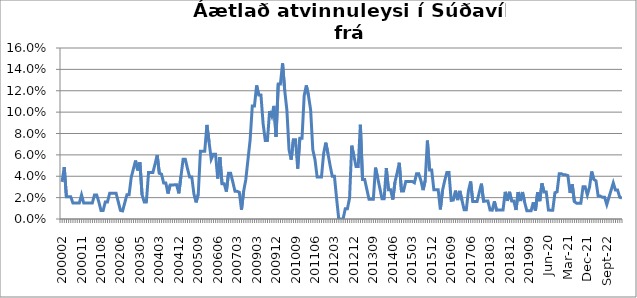
| Category | Series 0 |
|---|---|
| 200002 | 0.035 |
| 200003 | 0.049 |
| 200004 | 0.021 |
| 200005 | 0.021 |
| 200006 | 0.021 |
| 200007 | 0.015 |
| 200008 | 0.015 |
| 200009 | 0.015 |
| 200010 | 0.015 |
| 200011 | 0.023 |
| 200012 | 0.015 |
| 200101 | 0.015 |
| 200102 | 0.015 |
| 200103 | 0.015 |
| 200104 | 0.015 |
| 200105 | 0.023 |
| 200106 | 0.023 |
| 200107 | 0.016 |
| 200108 | 0.008 |
| 200110 | 0.008 |
| 200111 | 0.016 |
| 200112 | 0.016 |
| 200201 | 0.024 |
| 200202 | 0.024 |
| 200203 | 0.024 |
| 200204 | 0.024 |
| 200205 | 0.016 |
| 200206 | 0.008 |
| 200209 | 0.008 |
| 200210 | 0.015 |
| 200211 | 0.023 |
| 200212 | 0.023 |
| 200301 | 0.039 |
| 200302 | 0.047 |
| 200303 | 0.055 |
| 200304 | 0.045 |
| 200305 | 0.053 |
| 200306 | 0.023 |
| 200307 | 0.016 |
| 200309 | 0.016 |
| 200310 | 0.043 |
| 200311 | 0.043 |
| 200312 | 0.043 |
| 200401 | 0.051 |
| 200402 | 0.06 |
| 200403 | 0.043 |
| 200404 | 0.042 |
| 200405 | 0.034 |
| 200406 | 0.034 |
| 200407 | 0.024 |
| 200408 | 0.032 |
| 200409 | 0.032 |
| 200410 | 0.032 |
| 200411 | 0.032 |
| 200412 | 0.024 |
| 200501 | 0.04 |
| 200502 | 0.056 |
| 200503 | 0.056 |
| 200504 | 0.047 |
| 200505 | 0.039 |
| 200506 | 0.039 |
| 200507 | 0.023 |
| 200508 | 0.016 |
| 200509 | 0.023 |
| 200510 | 0.063 |
| 200511 | 0.063 |
| 200512 | 0.063 |
| 200601 | 0.088 |
| 200602 | 0.072 |
| 200603 | 0.056 |
| 200604 | 0.061 |
| 200605 | 0.061 |
| 200606 | 0.038 |
| 200607 | 0.058 |
| 200608 | 0.033 |
| 200609 | 0.033 |
| 200610 | 0.026 |
| 200611 | 0.043 |
| 200612 | 0.043 |
| 200701 | 0.034 |
| 200702 | 0.026 |
| 200703 | 0.026 |
| 200704 | 0.025 |
| 200709 | 0.009 |
| 200809 | 0.026 |
| 200810 | 0.037 |
| 200811 | 0.056 |
| 200812 | 0.074 |
| 200901 | 0.106 |
| 200902 | 0.106 |
| 200903 | 0.125 |
| 200904 | 0.116 |
| 200905 | 0.116 |
| 200906 | 0.089 |
| 200907 | 0.073 |
| 200908 | 0.073 |
| 200909 | 0.101 |
| 200910 | 0.096 |
| 200911 | 0.106 |
| 200912 | 0.077 |
| 201001 | 0.126 |
| 201002 | 0.126 |
| 201003 | 0.146 |
| 201004 | 0.12 |
| 201005 | 0.102 |
| 201006 | 0.065 |
| 201007 | 0.056 |
| 201008 | 0.074 |
| 201009 | 0.074 |
| 201010 | 0.047 |
| 201011 | 0.075 |
| 201012 | 0.075 |
| 201101 | 0.115 |
| 201102 | 0.125 |
| 201103 | 0.115 |
| 201104 | 0.102 |
| 201105 | 0.065 |
| 201106 | 0.056 |
| 201107 | 0.039 |
| 201108 | 0.039 |
| 201109 | 0.039 |
| 201110 | 0.061 |
| 201111 | 0.071 |
| 201112 | 0.061 |
| 201201 | 0.05 |
| 201202 | 0.04 |
| 201203 | 0.04 |
| 201204 | 0.019 |
| 201205 | 0 |
| 201206 | 0 |
| 201207 | 0 |
| 201208 | 0.01 |
| 201209 | 0.01 |
| 201210 | 0.02 |
| 201211 | 0.069 |
| 201212 | 0.059 |
| 201301 | 0.049 |
| 201302 | 0.049 |
| 201303 | 0.088 |
| 201304 | 0.037 |
| 201305 | 0.037 |
| 201306 | 0.028 |
| 201307 | 0.019 |
| 201308 | 0.019 |
| 201309 | 0.019 |
| 201310 | 0.048 |
| 201311 | 0.038 |
| 201312 | 0.029 |
| 201401 | 0.019 |
| 201402 | 0.019 |
| 201403 | 0.048 |
| 201404 | 0.027 |
| 201405 | 0.027 |
| 201406 | 0.018 |
| 201407 | 0.034 |
| 201408 | 0.043 |
| 201409 | 0.053 |
| 201410 | 0.026 |
| 201411 | 0.026 |
| 201412 | 0.035 |
| 201501 | 0.035 |
| 201502 | 0.035 |
| 201503 | 0.035 |
| 201504 | 0.034 |
| 201505 | 0.042 |
| 201506 | 0.042 |
| 201507 | 0.036 |
| 201508 | 0.027 |
| 201509 | 0.036 |
| 201510 | 0.073 |
| 201511 | 0.046 |
| 201512 | 0.046 |
| 201601 | 0.027 |
| 201602 | 0.027 |
| 201603 | 0.027 |
| 201604 | 0.009 |
| 201605 | 0.027 |
| 201606 | 0.036 |
| 201607 | 0.043 |
| 201608 | 0.043 |
| 201609 | 0.017 |
| 201610 | 0.018 |
| 201611 | 0.027 |
| 201612 | 0.018 |
| 201701 | 0.026 |
| 201702 | 0.018 |
| 201703 | 0.009 |
| 201704 | 0.009 |
| 201705 | 0.026 |
| 201706 | 0.035 |
| 201707 | 0.016 |
| 201708 | 0.016 |
| 201709 | 0.016 |
| 201710 | 0.025 |
| 201711 | 0.033 |
| 201712 | 0.017 |
| 201801 | 0.017 |
| 201802 | 0.017 |
| 201803 | 0.008 |
| 201804 | 0.008 |
| 201805 | 0.017 |
| 201806 | 0.008 |
| 201807 | 0.008 |
| 201808 | 0.008 |
| 201809 | 0.008 |
| 201810 | 0.025 |
| 201811 | 0.017 |
| 201812 | 0.025 |
| 201901 | 0.017 |
| 201902 | 0.017 |
| 201903 | 0.008 |
| 201904 | 0.025 |
| 201905 | 0.017 |
| 201906 | 0.025 |
| 201907 | 0.016 |
| 201908 | 0.008 |
| 201909 | 0.008 |
| 201910 | 0.008 |
| 201911 | 0.016 |
| 201912 | 0.008 |
| 202001 | 0.025 |
| feb.20 | 0.017 |
| mar.20 | 0.033 |
| apr.20 | 0.025 |
| maí.20 | 0.025 |
| jún.20 | 0.008 |
| júl.20 | 0.008 |
| ágú.20 | 0.008 |
| sep.20 | 0.025 |
| okt.20 | 0.025 |
| nóv.20 | 0.042 |
| des.20 | 0.042 |
| jan.21 | 0.041 |
| feb.21 | 0.041 |
| mar.21 | 0.041 |
| apr.21 | 0.024 |
| maí.21 | 0.033 |
| jún.21 | 0.016 |
| júl.21 | 0.015 |
| ágú.21 | 0.015 |
| sep.21 | 0.015 |
| okt.21 | 0.03 |
| nóv.21 | 0.03 |
| des.21 | 0.023 |
| jan.22 | 0.03 |
| feb.22 | 0.044 |
| mar.22 | 0.037 |
| apr.22 | 0.036 |
| maí.22 | 0.021 |
| jún.22 | 0.021 |
| júl.22 | 0.02 |
| ágú.22 | 0.02 |
| sep.22 | 0.014 |
| okt.22 | 0.02 |
| nóv.22 | 0.027 |
| des.22 | 0.034 |
| jan.23 | 0.027 |
| feb.23 | 0.027 |
| mar.23 | 0.02 |
| apr.23 | 0.02 |